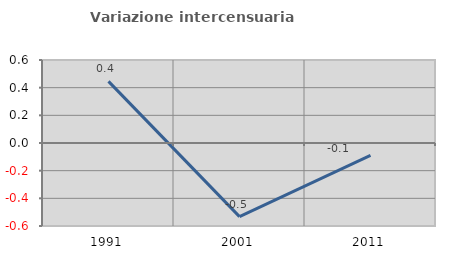
| Category | Variazione intercensuaria annua |
|---|---|
| 1991.0 | 0.446 |
| 2001.0 | -0.532 |
| 2011.0 | -0.09 |